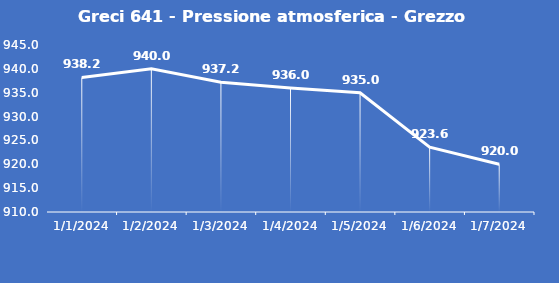
| Category | Greci 641 - Pressione atmosferica - Grezzo (hPa) |
|---|---|
| 1/1/24 | 938.2 |
| 1/2/24 | 940 |
| 1/3/24 | 937.2 |
| 1/4/24 | 936 |
| 1/5/24 | 935 |
| 1/6/24 | 923.6 |
| 1/7/24 | 920 |